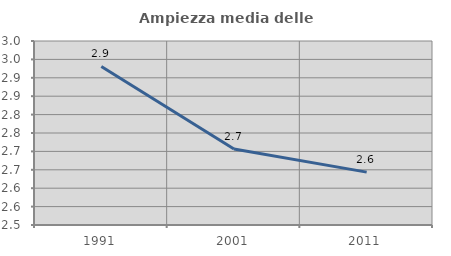
| Category | Ampiezza media delle famiglie |
|---|---|
| 1991.0 | 2.931 |
| 2001.0 | 2.706 |
| 2011.0 | 2.644 |